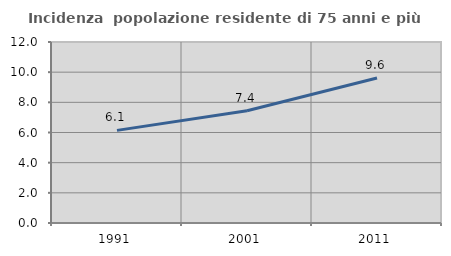
| Category | Incidenza  popolazione residente di 75 anni e più |
|---|---|
| 1991.0 | 6.141 |
| 2001.0 | 7.443 |
| 2011.0 | 9.61 |